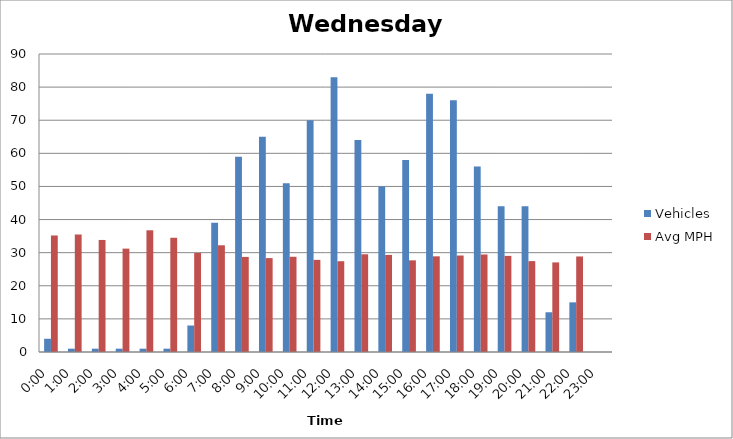
| Category | Vehicles | Avg MPH |
|---|---|---|
| 0:00 | 4 | 35.19 |
| 1:00 | 1 | 35.49 |
| 2:00 | 1 | 33.84 |
| 3:00 | 1 | 31.22 |
| 4:00 | 1 | 36.76 |
| 5:00 | 1 | 34.5 |
| 6:00 | 8 | 29.91 |
| 7:00 | 39 | 32.23 |
| 8:00 | 59 | 28.72 |
| 9:00 | 65 | 28.36 |
| 10:00 | 51 | 28.76 |
| 11:00 | 70 | 27.83 |
| 12:00 | 83 | 27.42 |
| 13:00 | 64 | 29.51 |
| 14:00 | 50 | 29.32 |
| 15:00 | 58 | 27.68 |
| 16:00 | 78 | 28.89 |
| 17:00 | 76 | 29.14 |
| 18:00 | 56 | 29.45 |
| 19:00 | 44 | 29.03 |
| 20:00 | 44 | 27.45 |
| 21:00 | 12 | 27.06 |
| 22:00 | 15 | 28.85 |
| 23:00 | 0 | 0 |